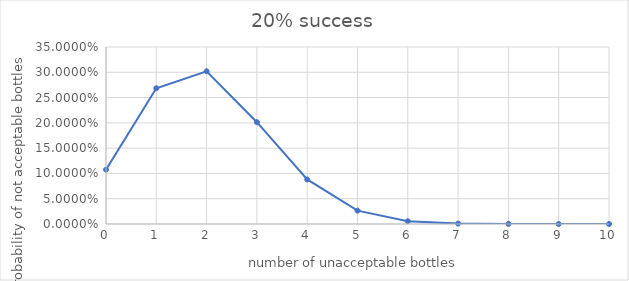
| Category | 20% success |
|---|---|
| 0.0 | 0.107 |
| 1.0 | 0.268 |
| 2.0 | 0.302 |
| 3.0 | 0.201 |
| 4.0 | 0.088 |
| 5.0 | 0.026 |
| 6.0 | 0.006 |
| 7.0 | 0.001 |
| 8.0 | 0 |
| 9.0 | 0 |
| 10.0 | 0 |